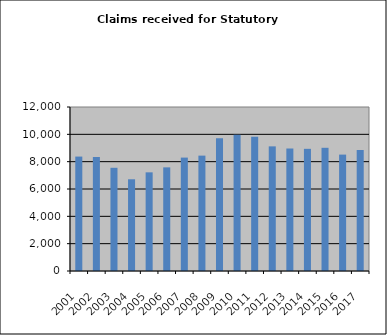
| Category | Series 0 |
|---|---|
| 2001.0 | 8373 |
| 2002.0 | 8343 |
| 2003.0 | 7552 |
| 2004.0 | 6712 |
| 2005.0 | 7219 |
| 2006.0 | 7583 |
| 2007.0 | 8298 |
| 2008.0 | 8442 |
| 2009.0 | 9709 |
| 2010.0 | 9961 |
| 2011.0 | 9830 |
| 2012.0 | 9120 |
| 2013.0 | 8963 |
| 2014.0 | 8939 |
| 2015.0 | 9015 |
| 2016.0 | 8517 |
| 2017.0 | 8853 |